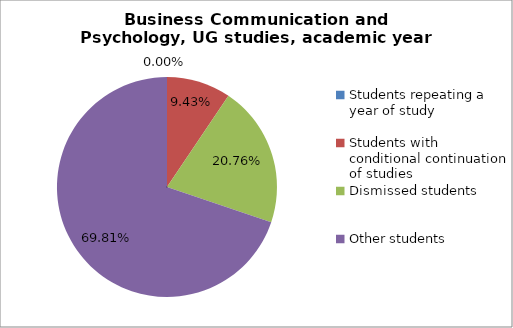
| Category | Series 0 |
|---|---|
| Students repeating a year of study | 0 |
| Students with conditional continuation of studies | 5 |
| Dismissed students | 11 |
| Other students | 37 |